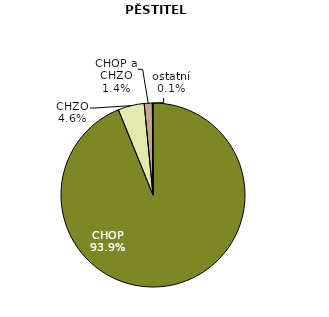
| Category | PĚSTITELÉ |
|---|---|
| CHOP | 93.858 |
| CHZO | 4.607 |
| CHOP a CHZO | 1.427 |
| ostatní | 0.109 |